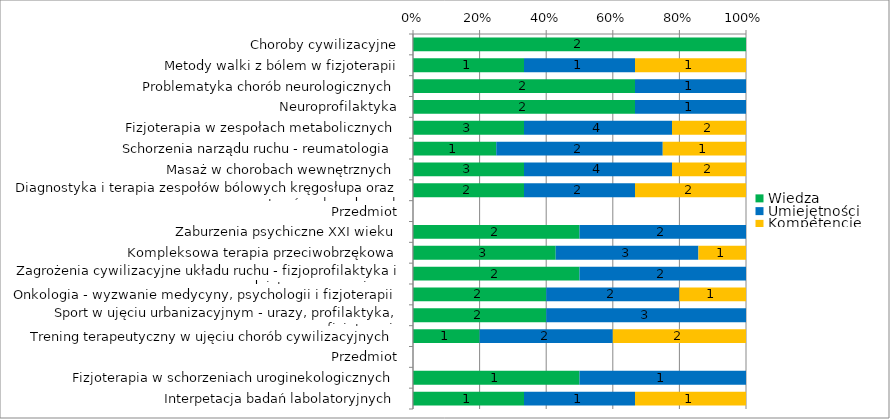
| Category | Wiedza | Umiejętności | Kompetencje |
|---|---|---|---|
| Choroby cywilizacyjne | 2 | 0 | 0 |
| Metody walki z bólem w fizjoterapii | 1 | 1 | 1 |
| Problematyka chorób neurologicznych | 2 | 1 | 0 |
| Neuroprofilaktyka | 2 | 1 | 0 |
| Fizjoterapia w zespołach metabolicznych | 3 | 4 | 2 |
| Schorzenia narządu ruchu - reumatologia | 1 | 2 | 1 |
| Masaż w chorobach wewnętrznych | 3 | 4 | 2 |
| Diagnostyka i terapia zespołów bólowych kręgosłupa oraz stawów obwodowych | 2 | 2 | 2 |
| Przedmiot | 0 | 0 | 0 |
| Zaburzenia psychiczne XXI wieku | 2 | 2 | 0 |
| Kompleksowa terapia przeciwobrzękowa | 3 | 3 | 1 |
| Zagrożenia cywilizacyjne układu ruchu - fizjoprofilaktyka i poradnictwo ergonomiczne | 2 | 2 | 0 |
| Onkologia - wyzwanie medycyny, psychologii i fizjoterapii | 2 | 2 | 1 |
| Sport w ujęciu urbanizacyjnym - urazy, profilaktyka, fizjoterapia | 2 | 3 | 0 |
| Trening terapeutyczny w ujęciu chorób cywilizacyjnych | 1 | 2 | 2 |
| Przedmiot | 0 | 0 | 0 |
| Fizjoterapia w schorzeniach uroginekologicznych | 1 | 1 | 0 |
| Interpetacja badań labolatoryjnych | 1 | 1 | 1 |